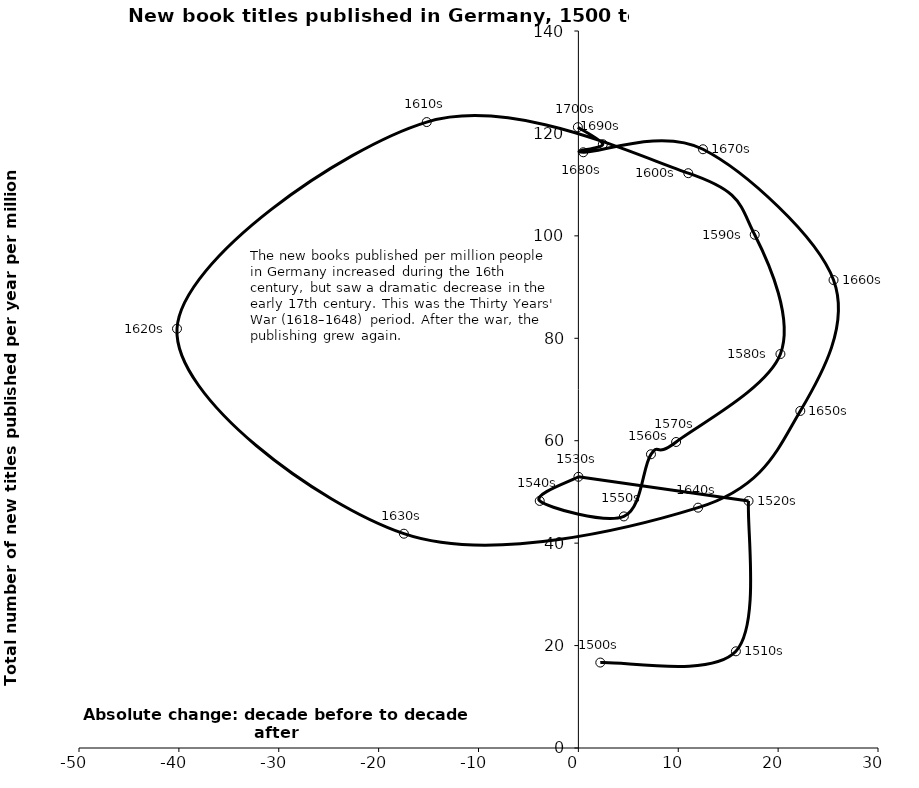
| Category | Series 0 |
|---|---|
| 2.1938815204333864 | 16.685 |
| 15.7733349554993 | 18.879 |
| 17.038560184138248 | 48.232 |
| 0.006379211065528523 | 52.956 |
| -3.8693182200181937 | 48.245 |
| 4.553763713131602 | 45.218 |
| 7.267939831690825 | 57.352 |
| 9.785745272980733 | 59.753 |
| 20.230733377553786 | 76.924 |
| 17.65585936579391 | 100.215 |
| 11.00195036824551 | 112.235 |
| -15.183895493019513 | 122.219 |
| -40.18738864143596 | 81.868 |
| -17.46947931783434 | 41.844 |
| 11.985205997812088 | 46.929 |
| 22.221991531360437 | 65.814 |
| 25.548588148914007 | 91.373 |
| 12.474589448188063 | 116.912 |
| 0.48899278543632363 | 116.322 |
| 2.447985133467796 | 117.89 |
| -0.051571424042016645 | 121.218 |